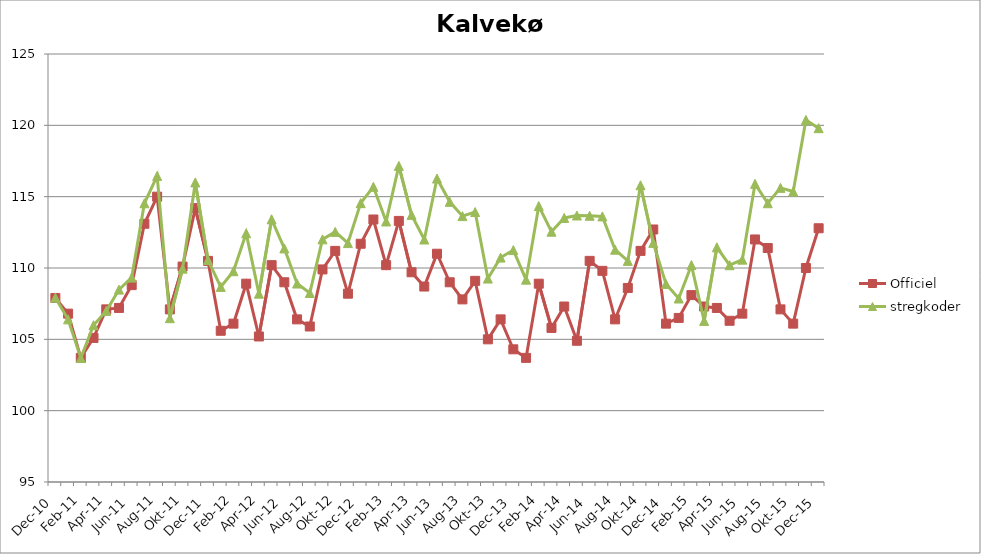
| Category | Officiel | stregkoder |
|---|---|---|
|  Dec-10 | 107.9 | 107.921 |
|  Jan-11 | 106.8 | 106.401 |
|  Feb-11 | 103.7 | 103.688 |
|  Mar-11 | 105.1 | 105.992 |
|  Apr-11 | 107.1 | 106.991 |
|  Maj-11 | 107.2 | 108.485 |
|  Jun-11 | 108.8 | 109.326 |
|  Jul-11 | 113.1 | 114.537 |
|  Aug-11 | 115 | 116.453 |
|  Sep-11 | 107.1 | 106.483 |
|  Okt-11 | 110.1 | 109.956 |
|  Nov-11 | 114.2 | 115.999 |
|  Dec-11 | 110.5 | 110.558 |
|  Jan-12 | 105.6 | 108.677 |
|  Feb-12 | 106.1 | 109.776 |
|  Mar-12 | 108.9 | 112.433 |
|  Apr-12 | 105.2 | 108.201 |
|  Maj-12 | 110.2 | 113.409 |
|  Jun-12 | 109 | 111.374 |
|  Jul-12 | 106.4 | 108.911 |
|  Aug-12 | 105.9 | 108.249 |
|  Sep-12 | 109.9 | 112.009 |
|  Okt-12 | 111.2 | 112.531 |
|  Nov-12 | 108.2 | 111.748 |
|  Dec-12 | 111.7 | 114.546 |
|  Jan-13 | 113.4 | 115.69 |
|  Feb-13 | 110.2 | 113.264 |
|  Mar-13 | 113.3 | 117.155 |
|  Apr-13 | 109.7 | 113.722 |
|  Maj-13 | 108.7 | 111.998 |
|  Jun-13 | 111 | 116.272 |
|  Jul-13 | 109 | 114.639 |
|  Aug-13 | 107.8 | 113.636 |
|  Sep-13 | 109.1 | 113.923 |
|  Okt-13 | 105 | 109.259 |
|  Nov-13 | 106.4 | 110.73 |
|  Dec-13 | 104.3 | 111.257 |
|  Jan-14 | 103.7 | 109.182 |
|  Feb-14 | 108.9 | 114.339 |
|  Mar-14 | 105.8 | 112.544 |
|  Apr-14 | 107.3 | 113.509 |
|  Maj-14 | 104.9 | 113.679 |
|  Jun-14 | 110.5 | 113.661 |
|  Jul-14 | 109.8 | 113.615 |
|  Aug-14 | 106.4 | 111.282 |
|  Sep-14 | 108.6 | 110.497 |
|  Okt-14 | 111.2 | 115.799 |
|  Nov-14 | 112.7 | 111.761 |
|  Dec-14 | 106.1 | 108.884 |
|  Jan-15 | 106.5 | 107.862 |
|  Feb-15 | 108.1 | 110.202 |
|  Mar-15 | 107.3 | 106.291 |
|  Apr-15 | 107.2 | 111.449 |
|  Maj-15 | 106.3 | 110.195 |
| Jun-15 | 106.8 | 110.587 |
| Jul-15 | 112 | 115.898 |
| Aug-15 | 111.4 | 114.539 |
| Sep-15 | 107.1 | 115.618 |
| Okt-15 | 106.1 | 115.361 |
| Nov-15 | 110 | 120.377 |
| Dec-15 | 112.786 | 119.801 |